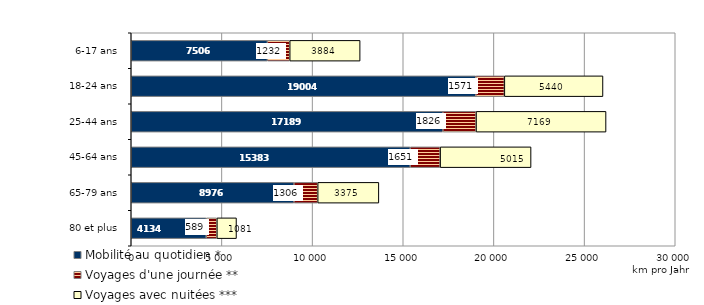
| Category | Mobilité au quotidien * | Voyages d'une journée ** | Voyages avec nuitées *** |
|---|---|---|---|
| 6-17 ans | 7506.048 | 1232.207 | 3883.596 |
| 18-24 ans | 19004.301 | 1570.974 | 5439.747 |
| 25-44 ans | 17188.849 | 1825.782 | 7169.413 |
| 45-64 ans | 15383.115 | 1650.906 | 5014.903 |
| 65-79 ans | 8975.548 | 1305.503 | 3374.624 |
| 80 et plus | 4134.185 | 588.596 | 1080.63 |